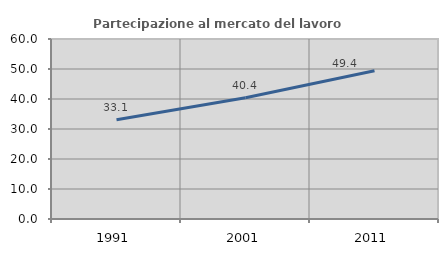
| Category | Partecipazione al mercato del lavoro  femminile |
|---|---|
| 1991.0 | 33.061 |
| 2001.0 | 40.411 |
| 2011.0 | 49.389 |